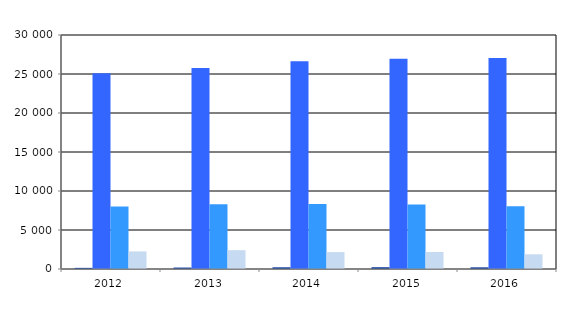
| Category | Series 0 | Series 1 | Series 2 | Series 3 |
|---|---|---|---|---|
| 2012.0 | 145 | 25087 | 8011 | 2254 |
| 2013.0 | 182 | 25772 | 8298 | 2412 |
| 2014.0 | 214 | 26643 | 8323 | 2163 |
| 2015.0 | 223 | 26966 | 8259 | 2181 |
| 2016.0 | 210 | 27066 | 8044 | 1887 |